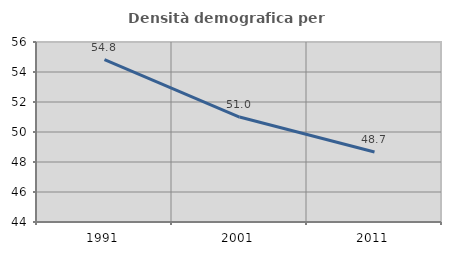
| Category | Densità demografica |
|---|---|
| 1991.0 | 54.83 |
| 2001.0 | 50.997 |
| 2011.0 | 48.663 |